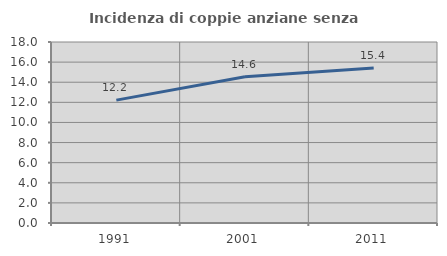
| Category | Incidenza di coppie anziane senza figli  |
|---|---|
| 1991.0 | 12.221 |
| 2001.0 | 14.552 |
| 2011.0 | 15.422 |